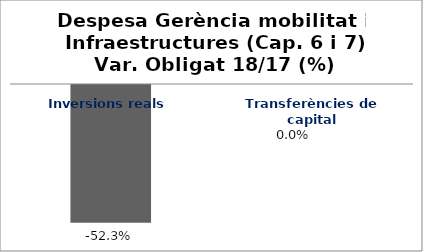
| Category | Series 0 |
|---|---|
| Inversions reals | -0.523 |
| Transferències de capital | 0 |